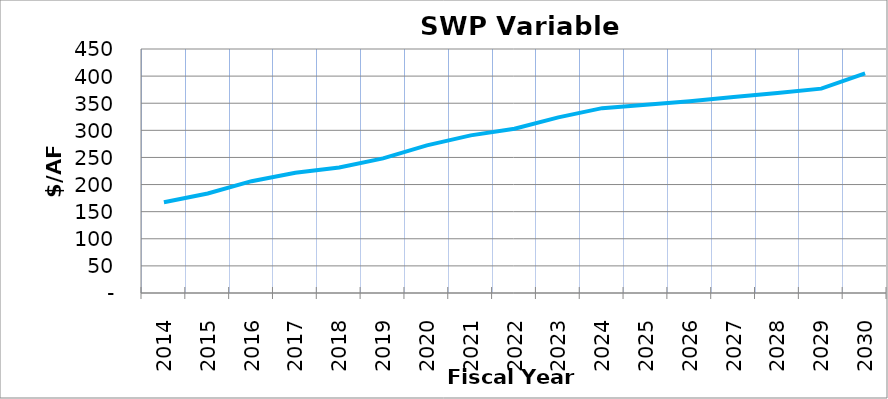
| Category | Series 2 |
|---|---|
| 2014.0 | 167.472 |
| 2015.0 | 183.481 |
| 2016.0 | 206.214 |
| 2017.0 | 221.935 |
| 2018.0 | 231.394 |
| 2019.0 | 248.258 |
| 2020.0 | 272.213 |
| 2021.0 | 290.671 |
| 2022.0 | 303.027 |
| 2023.0 | 323.86 |
| 2024.0 | 340.929 |
| 2025.0 | 347.057 |
| 2026.0 | 353.77 |
| 2027.0 | 361.399 |
| 2028.0 | 368.663 |
| 2029.0 | 376.878 |
| 2030.0 | 404.911 |